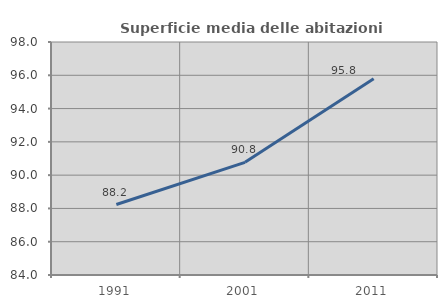
| Category | Superficie media delle abitazioni occupate |
|---|---|
| 1991.0 | 88.233 |
| 2001.0 | 90.77 |
| 2011.0 | 95.787 |